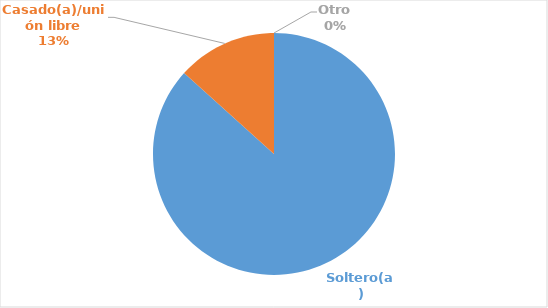
| Category | Series 0 |
|---|---|
| Soltero(a) | 0.867 |
| Casado(a)/unión libre | 0.133 |
| Otro | 0 |